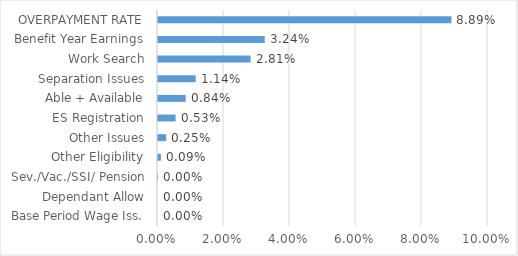
| Category | Series 0 |
|---|---|
| Base Period Wage Iss. | 0 |
| Dependant Allow | 0 |
| Sev./Vac./SSI/ Pension | 0 |
| Other Eligibility | 0.001 |
| Other Issues | 0.002 |
| ES Registration | 0.005 |
| Able + Available | 0.008 |
| Separation Issues | 0.011 |
| Work Search | 0.028 |
| Benefit Year Earnings | 0.032 |
| OVERPAYMENT RATE | 0.089 |